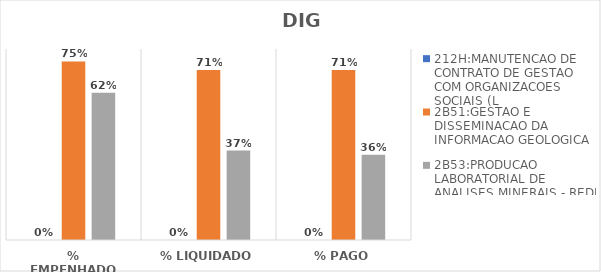
| Category | 212H:MANUTENCAO DE CONTRATO DE GESTAO COM ORGANIZACOES SOCIAIS (L | 2B51:GESTAO E DISSEMINACAO DA INFORMACAO GEOLOGICA | 2B53:PRODUCAO LABORATORIAL DE ANALISES MINERAIS - REDE LAMIN |
|---|---|---|---|
| % EMPENHADO | 0 | 0.748 | 0.617 |
| % LIQUIDADO | 0 | 0.712 | 0.375 |
| % PAGO | 0 | 0.712 | 0.358 |